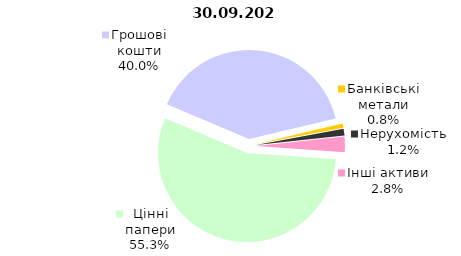
| Category | Всього |
|---|---|
| Цінні папери | 1477.04 |
| Грошові кошти | 1067.988 |
| Банківські метали | 20.327 |
| Нерухомість | 32.61 |
| Інші активи | 75.073 |